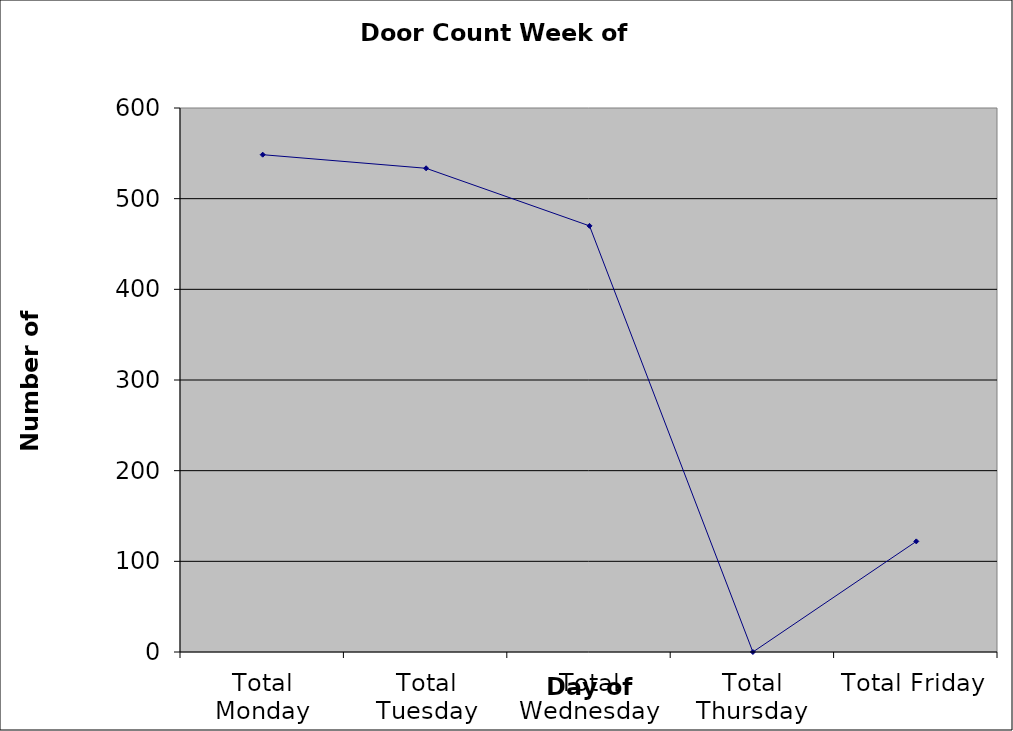
| Category | Series 0 |
|---|---|
| Total Monday | 548.5 |
| Total Tuesday | 533.5 |
| Total Wednesday | 470 |
| Total Thursday | 0 |
| Total Friday | 122 |